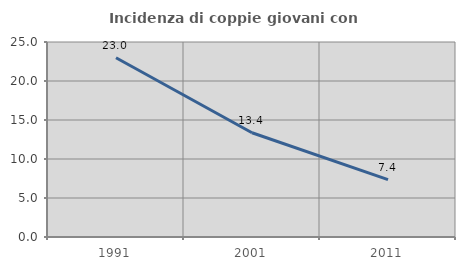
| Category | Incidenza di coppie giovani con figli |
|---|---|
| 1991.0 | 22.977 |
| 2001.0 | 13.369 |
| 2011.0 | 7.352 |